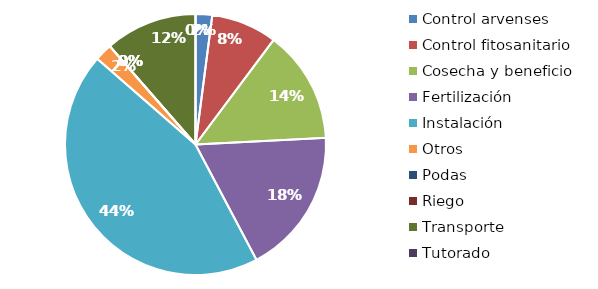
| Category | Valor |
|---|---|
| Control arvenses | 292654 |
| Control fitosanitario | 1162381 |
| Cosecha y beneficio | 1991802.004 |
| Fertilización | 2573967 |
| Instalación | 6290522.806 |
| Otros | 309836 |
| Podas | 0 |
| Riego | 0 |
| Transporte | 1626787 |
| Tutorado | 0 |